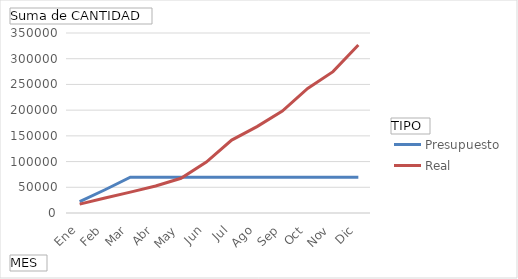
| Category | Presupuesto | Real |
|---|---|---|
| Ene | 22000 | 17330 |
| Feb | 45200 | 29095 |
| Mar | 69600 | 40585 |
| Abr | 69600 | 52530 |
| May | 69600 | 67555 |
| Jun | 69600 | 99010 |
| Jul | 69600 | 141800 |
| Ago | 69600 | 167970 |
| Sep | 69600 | 198120 |
| Oct | 69600 | 242280 |
| Nov | 69600 | 274875 |
| Dic | 69600 | 326765 |